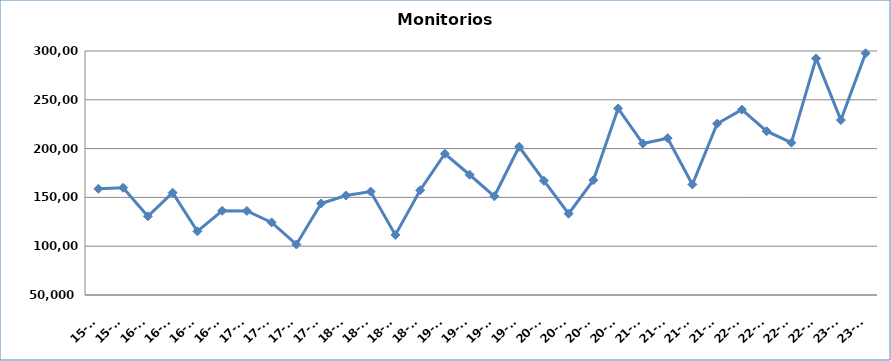
| Category | Monitorios ingresados |
|---|---|
| 15-T3 | 158859 |
| 15-T4 | 159890 |
| 16-T1 | 130680 |
| 16-T2 | 154860 |
| 16-T3 | 115269 |
| 16-T4 | 136245 |
| 17-T1 | 136155 |
| 17-T2 | 124382 |
| 17-T3 | 101751 |
| 17-T4 | 143788 |
| 18-T1 | 151974 |
| 18-T2 | 155991 |
| 18-T3 | 111544 |
| 18-T4 | 157337 |
| 19-T1 | 194715 |
| 19-T2 | 173225 |
| 19-T3 | 151156 |
| 19-T4 | 201895 |
| 20-T1 | 167095 |
| 20-T2 | 133351 |
| 20-T3 | 167630 |
| 20-T4 | 241119 |
| 21-T1 | 205212 |
| 21-T2 | 210679 |
| 21-T3 | 163259 |
| 21-T4 | 225536 |
| 22-T1 | 239972 |
| 22-T2 | 217801 |
| 22-T3 | 206093 |
| 22-T4 | 292388 |
| 23-T1 | 229190 |
| 23-T2 | 297658 |